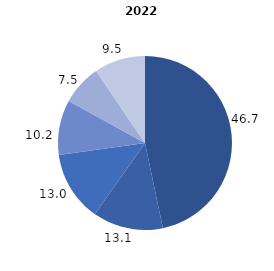
| Category | Series 0 |
|---|---|
| 0 | 46.7 |
| 1 | 13.1 |
| 2 | 13 |
| 3 | 10.2 |
| 4 | 7.5 |
| 5 | 9.5 |